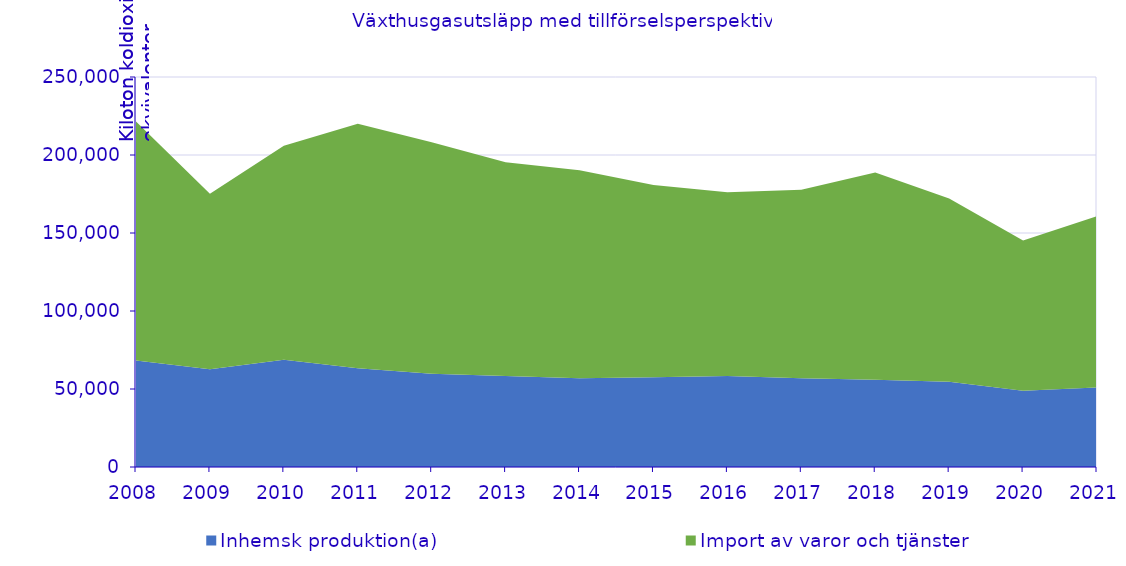
| Category | Inhemsk produktion(a) | Import av varor och tjänster |
|---|---|---|
| 2008.0 | 68191.958 | 153350.674 |
| 2009.0 | 62611.475 | 112540.548 |
| 2010.0 | 68783.8 | 137134.024 |
| 2011.0 | 63369.394 | 156726.107 |
| 2012.0 | 59840.502 | 148256.619 |
| 2013.0 | 58371.948 | 136979.63 |
| 2014.0 | 56902.913 | 133249.192 |
| 2015.0 | 57464.769 | 123267.922 |
| 2016.0 | 58288.397 | 117855.253 |
| 2017.0 | 56813.724 | 120894.336 |
| 2018.0 | 55975.287 | 132770.577 |
| 2019.0 | 54687.124 | 117400.312 |
| 2020.0 | 48941.028 | 96237.142 |
| 2021.0 | 51030.25 | 109758.613 |